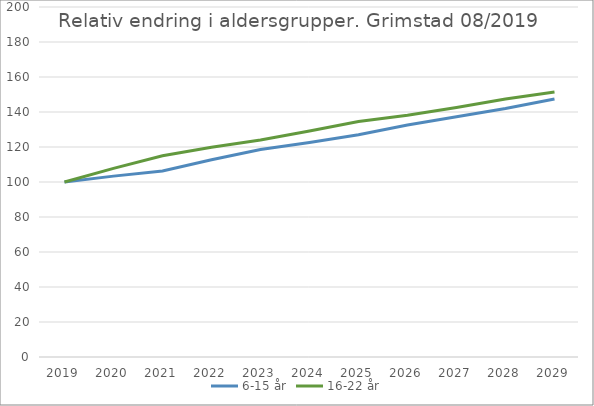
| Category | 6-15 år | 16-22 år |
|---|---|---|
| 2019 | 100 | 100 |
| 2020 | 103.359 | 107.786 |
| 2021 | 106.275 | 114.957 |
| 2022 | 112.73 | 119.812 |
| 2023 | 118.609 | 123.956 |
| 2024 | 122.633 | 129.19 |
| 2025 | 127.034 | 134.557 |
| 2026 | 132.602 | 138.127 |
| 2027 | 137.343 | 142.546 |
| 2028 | 141.968 | 147.484 |
| 2029 | 147.461 | 151.383 |